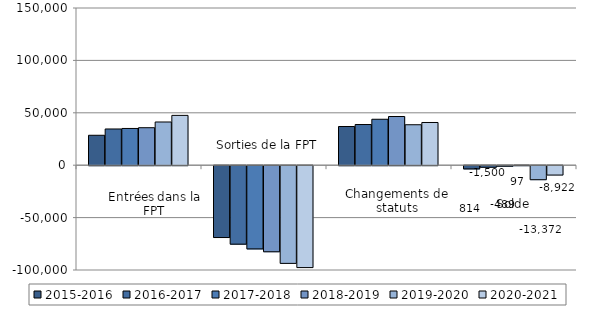
| Category | 2015-2016 | 2016-2017 | 2017-2018 | 2018-2019 | 2019-2020 | 2020-2021 |
|---|---|---|---|---|---|---|
| Entrées | 28555 | 34565 | 35056 | 35765 | 41233 | 47542 |
| Sorties | -68555 | -74877 | -79389 | -82137 | -93204 | -97222 |
| Changement de statut | 36926 | 38812 | 43844 | 46469 | 38599 | 40758 |
| Solde | -3074 | -1500 | -489 | 97 | -13372 | -8922 |